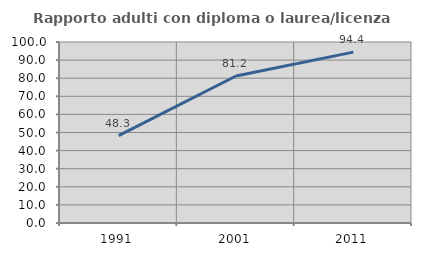
| Category | Rapporto adulti con diploma o laurea/licenza media  |
|---|---|
| 1991.0 | 48.263 |
| 2001.0 | 81.21 |
| 2011.0 | 94.413 |